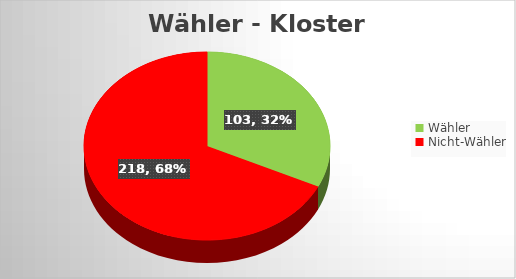
| Category | Series 0 |
|---|---|
| Wähler | 103 |
| Nicht-Wähler | 218 |